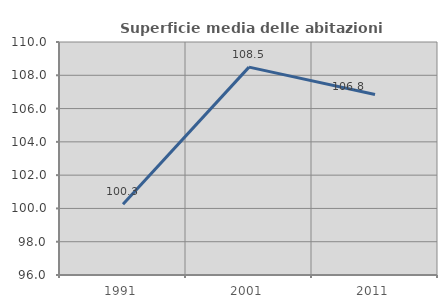
| Category | Superficie media delle abitazioni occupate |
|---|---|
| 1991.0 | 100.25 |
| 2001.0 | 108.491 |
| 2011.0 | 106.841 |